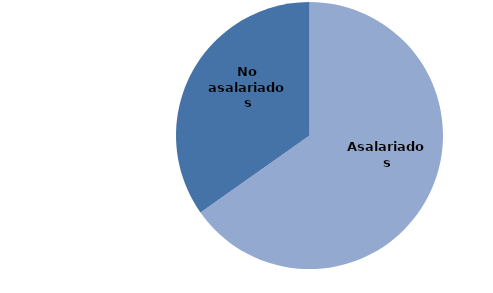
| Category | Series 0 |
|---|---|
| Asalariados | 65.213 |
| No asalariados | 34.787 |